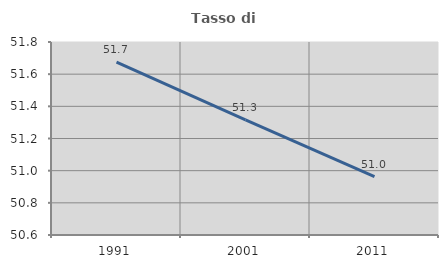
| Category | Tasso di occupazione   |
|---|---|
| 1991.0 | 51.674 |
| 2001.0 | 51.316 |
| 2011.0 | 50.963 |